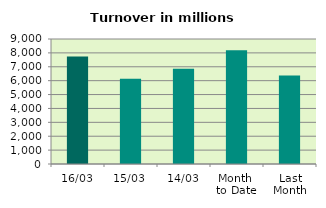
| Category | Series 0 |
|---|---|
| 16/03 | 7731.832 |
| 15/03 | 6137.984 |
| 14/03 | 6858.83 |
| Month 
to Date | 8198.703 |
| Last
Month | 6378.947 |